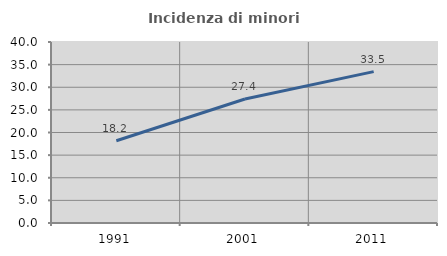
| Category | Incidenza di minori stranieri |
|---|---|
| 1991.0 | 18.182 |
| 2001.0 | 27.411 |
| 2011.0 | 33.457 |